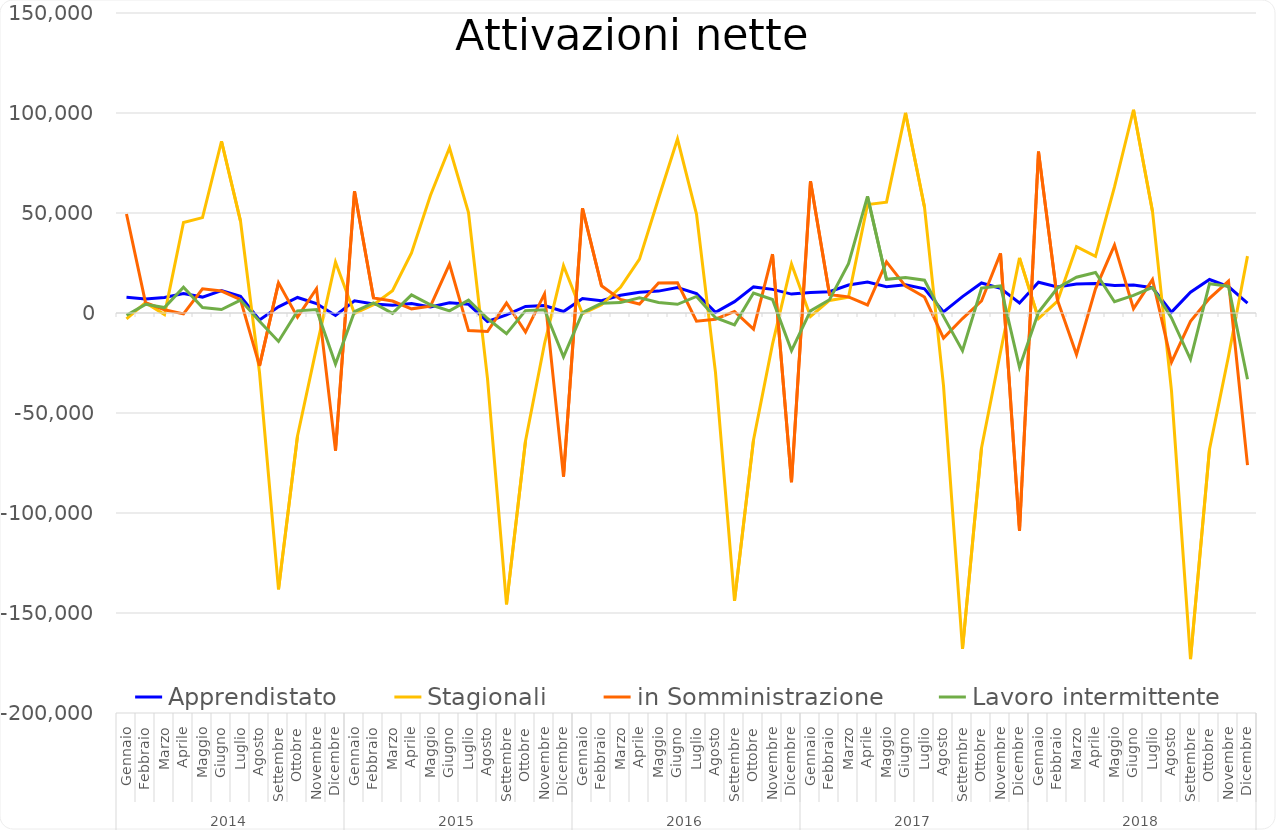
| Category | Apprendistato | Stagionali | in Somministrazione | Lavoro intermittente |
|---|---|---|---|---|
| 0 | 7863 | -2920 | 49472 | -1101 |
| 1 | 6955 | 5163 | 5178 | 4322 |
| 2 | 7721 | -748 | 1634 | 2706 |
| 3 | 9758 | 45226 | -471 | 12908 |
| 4 | 7956 | 47688 | 12121 | 2776 |
| 5 | 11246 | 85873 | 10963 | 1733 |
| 6 | 8345 | 45937 | 6677 | 6462 |
| 7 | -3479 | -29751 | -26473 | -4141 |
| 8 | 3067 | -138156 | 15089 | -14209 |
| 9 | 7763 | -61478 | -2060 | 1076 |
| 10 | 4748 | -17330 | 12180 | 1697 |
| 11 | -1268 | 25518 | -68837 | -25505 |
| 12 | 6076 | -214 | 60873 | 654 |
| 13 | 4532 | 4115 | 7507 | 5064 |
| 14 | 3912 | 11182 | 5965 | -203 |
| 15 | 4773 | 30005 | 2077 | 9052 |
| 16 | 3043 | 58845 | 3381 | 4123 |
| 17 | 5065 | 82610 | 24417 | 1091 |
| 18 | 4354 | 50198 | -8770 | 6418 |
| 19 | -4239 | -32824 | -9290 | -2762 |
| 20 | -957 | -145714 | 4975 | -10299 |
| 21 | 3276 | -64012 | -9545 | 1193 |
| 22 | 3742 | -15380 | 9528 | 1636 |
| 23 | 749 | 23615 | -81840 | -21957 |
| 24 | 7218 | -342 | 52332 | 218 |
| 25 | 6179 | 4121 | 13625 | 4859 |
| 26 | 8908 | 12870 | 6774 | 5191 |
| 27 | 10411 | 26959 | 4483 | 7588 |
| 28 | 10950 | 57270 | 14984 | 5292 |
| 29 | 12722 | 86964 | 15100 | 4350 |
| 30 | 9769 | 49429 | -4114 | 8259 |
| 31 | 303 | -29813 | -3128 | -2315 |
| 32 | 5673 | -143890 | 798 | -5892 |
| 33 | 13054 | -63436 | -8029 | 9957 |
| 34 | 11822 | -15589 | 29480 | 6733 |
| 35 | 9459 | 24547 | -84618 | -18780 |
| 36 | 10205 | -1725 | 65825 | 1036 |
| 37 | 10635 | 6266 | 9207 | 6634 |
| 38 | 13986 | 7907 | 8068 | 24638 |
| 39 | 15486 | 54190 | 4000 | 58337 |
| 40 | 13178 | 55431 | 25538 | 16843 |
| 41 | 14131 | 100053 | 13467 | 17722 |
| 42 | 12055 | 52938 | 7986 | 16391 |
| 43 | 522 | -36345 | -12569 | -1673 |
| 44 | 8189 | -167942 | -2774 | -18879 |
| 45 | 15012 | -67438 | 6007 | 12459 |
| 46 | 12309 | -19484 | 29830 | 13552 |
| 47 | 5052 | 27551 | -108893 | -27183 |
| 48 | 15389 | -2792 | 80711 | 354 |
| 49 | 13068 | 5895 | 6430 | 12506 |
| 50 | 14530 | 33169 | -20785 | 17891 |
| 51 | 14790 | 28364 | 12058 | 20226 |
| 52 | 13744 | 63027 | 33924 | 5614 |
| 53 | 13990 | 101617 | 2162 | 8800 |
| 54 | 12633 | 50781 | 16690 | 12773 |
| 55 | 426 | -38893 | -24523 | -2463 |
| 56 | 10398 | -173101 | -4159 | -23153 |
| 57 | 16753 | -68080 | 7329 | 14665 |
| 58 | 13193 | -21592 | 15946 | 13306 |
| 59 | 4955 | 28444 | -76044 | -33131 |